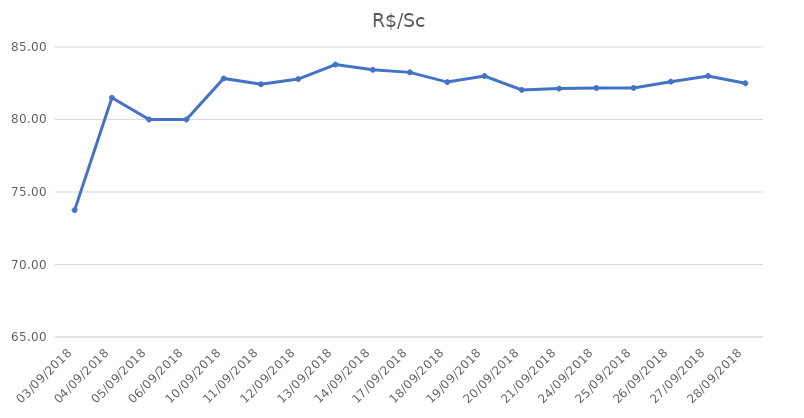
| Category | R$/Sc |
|---|---|
| 03/09/2018 | 73.75 |
| 04/09/2018 | 81.5 |
| 05/09/2018 | 80 |
| 06/09/2018 | 80 |
| 10/09/2018 | 82.83 |
| 11/09/2018 | 82.43 |
| 12/09/2018 | 82.79 |
| 13/09/2018 | 83.79 |
| 14/09/2018 | 83.43 |
| 17/09/2018 | 83.25 |
| 18/09/2018 | 82.58 |
| 19/09/2018 | 83 |
| 20/09/2018 | 82.04 |
| 21/09/2018 | 82.13 |
| 24/09/2018 | 82.17 |
| 25/09/2018 | 82.18 |
| 26/09/2018 | 82.61 |
| 27/09/2018 | 83 |
| 28/09/2018 | 82.5 |